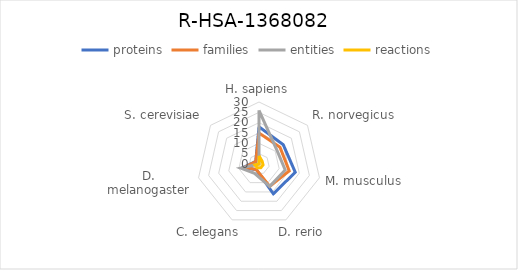
| Category | proteins | families | entities | reactions |
|---|---|---|---|---|
| H. sapiens | 18 | 15 | 26 | 4 |
| R. norvegicus | 15 | 13 | 11 | 2 |
| M. musculus | 18 | 15 | 13 | 2 |
| D. rerio | 16 | 12 | 12 | 2 |
| C. elegans | 3 | 3 | 5 | 2 |
| D. melanogaster | 8 | 7 | 9 | 2 |
| S. cerevisiae | 2 | 2 | 0 | 0 |